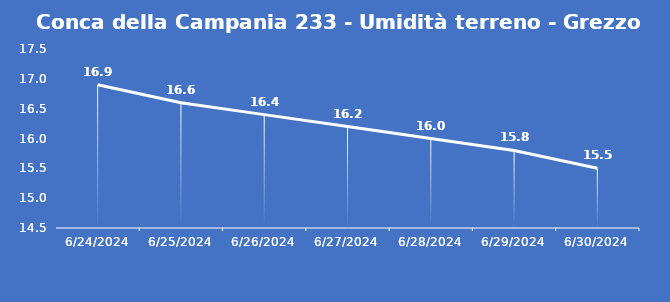
| Category | Conca della Campania 233 - Umidità terreno - Grezzo (%VWC) |
|---|---|
| 6/24/24 | 16.9 |
| 6/25/24 | 16.6 |
| 6/26/24 | 16.4 |
| 6/27/24 | 16.2 |
| 6/28/24 | 16 |
| 6/29/24 | 15.8 |
| 6/30/24 | 15.5 |